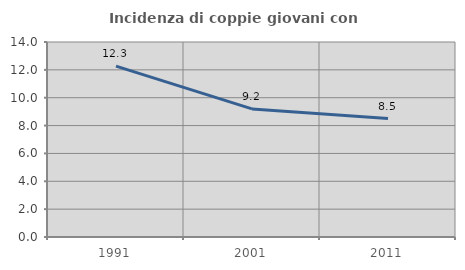
| Category | Incidenza di coppie giovani con figli |
|---|---|
| 1991.0 | 12.27 |
| 2001.0 | 9.197 |
| 2011.0 | 8.501 |